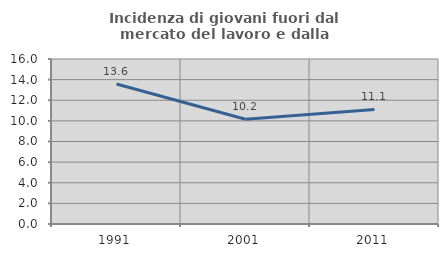
| Category | Incidenza di giovani fuori dal mercato del lavoro e dalla formazione  |
|---|---|
| 1991.0 | 13.571 |
| 2001.0 | 10.156 |
| 2011.0 | 11.111 |